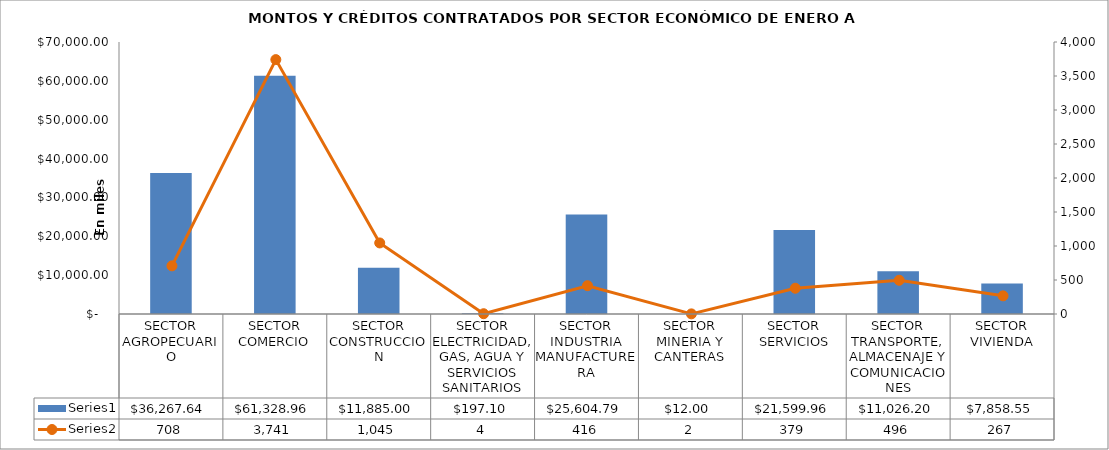
| Category | Series 0 |
|---|---|
| SECTOR AGROPECUARIO | 36267.635 |
| SECTOR COMERCIO | 61328.96 |
| SECTOR CONSTRUCCION | 11885.003 |
| SECTOR ELECTRICIDAD, GAS, AGUA Y SERVICIOS SANITARIOS | 197.1 |
| SECTOR INDUSTRIA MANUFACTURERA | 25604.792 |
| SECTOR MINERIA Y CANTERAS | 12 |
| SECTOR SERVICIOS | 21599.963 |
| SECTOR TRANSPORTE, ALMACENAJE Y COMUNICACIONES | 11026.199 |
| SECTOR VIVIENDA | 7858.547 |